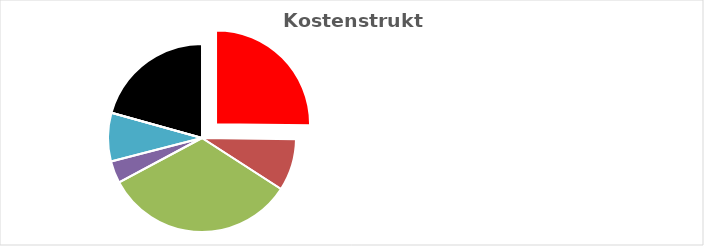
| Category | Series 0 |
|---|---|
| KV-Entgelt produktiv Tätige | 1 |
| Weitere Personalkosten produktiv | 0.354 |
| Personalnebenkosten | 1.312 |
| Unproduktives Personal | 0.151 |
| Deckung Personalgemeinkosten | 0.331 |
| Umlagen ohne GZ | 0 |
| Gesamtzuschlag | 0.82 |